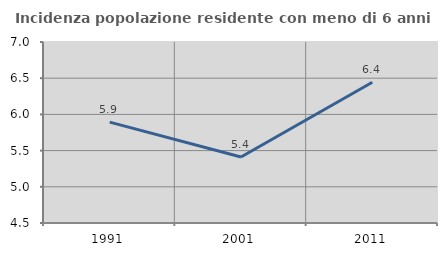
| Category | Incidenza popolazione residente con meno di 6 anni |
|---|---|
| 1991.0 | 5.893 |
| 2001.0 | 5.412 |
| 2011.0 | 6.444 |